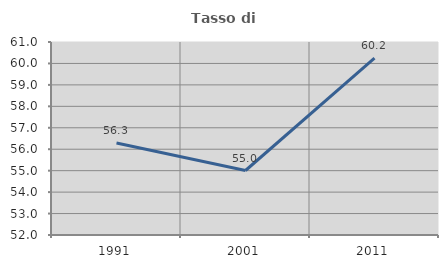
| Category | Tasso di occupazione   |
|---|---|
| 1991.0 | 56.287 |
| 2001.0 | 55.008 |
| 2011.0 | 60.247 |